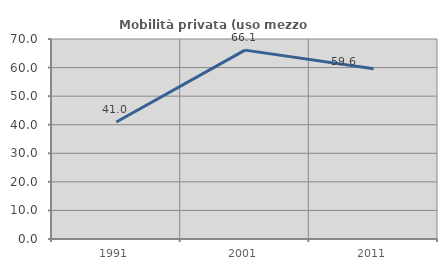
| Category | Mobilità privata (uso mezzo privato) |
|---|---|
| 1991.0 | 40.964 |
| 2001.0 | 66.102 |
| 2011.0 | 59.574 |